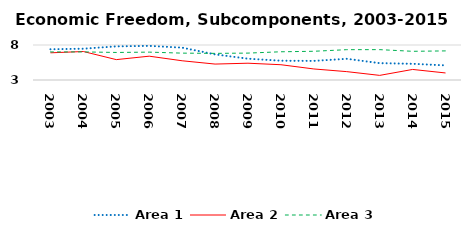
| Category | Area 1 | Area 2 | Area 3 |
|---|---|---|---|
| 2003.0 | 7.392 | 6.882 | 7.012 |
| 2004.0 | 7.471 | 7.069 | 7.014 |
| 2005.0 | 7.804 | 5.911 | 6.934 |
| 2006.0 | 7.876 | 6.402 | 6.982 |
| 2007.0 | 7.62 | 5.746 | 6.838 |
| 2008.0 | 6.662 | 5.275 | 6.804 |
| 2009.0 | 6.043 | 5.398 | 6.843 |
| 2010.0 | 5.754 | 5.183 | 7.031 |
| 2011.0 | 5.729 | 4.578 | 7.103 |
| 2012.0 | 6.03 | 4.196 | 7.333 |
| 2013.0 | 5.407 | 3.658 | 7.338 |
| 2014.0 | 5.315 | 4.508 | 7.098 |
| 2015.0 | 5.085 | 4.006 | 7.157 |